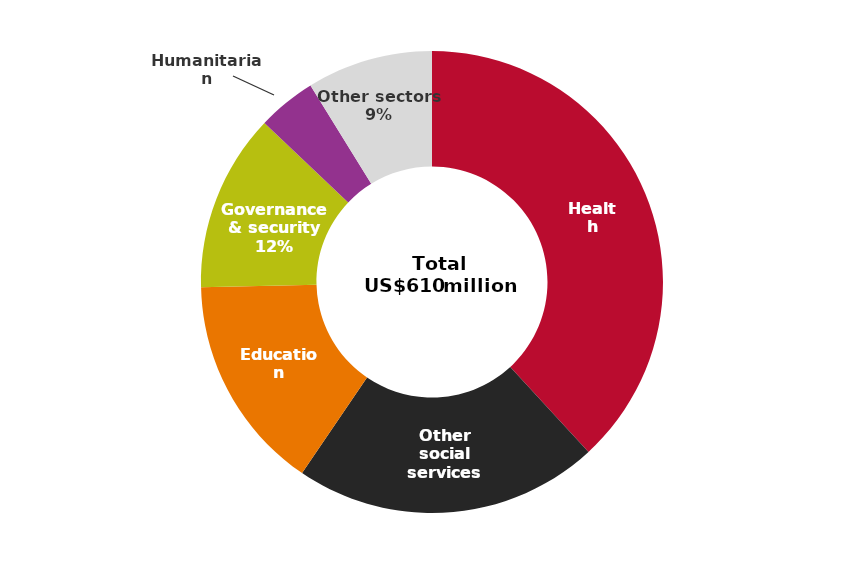
| Category | Share |
|---|---|
| Health | 0.382 |
| Other social services | 0.214 |
| Education | 0.151 |
| Governance & security | 0.125 |
| Humanitarian | 0.041 |
| Other sectors | 0.088 |